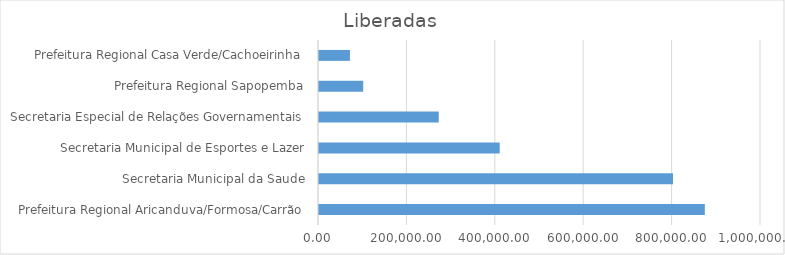
| Category | Series 0 |
|---|---|
| Prefeitura Regional Aricanduva/Formosa/Carrão | 872909 |
| Secretaria Municipal da Saude | 800971.26 |
| Secretaria Municipal de Esportes e Lazer | 408904.4 |
| Secretaria Especial de Relações Governamentais | 270905.23 |
| Prefeitura Regional Sapopemba | 100000 |
| Prefeitura Regional Casa Verde/Cachoeirinha | 70000 |